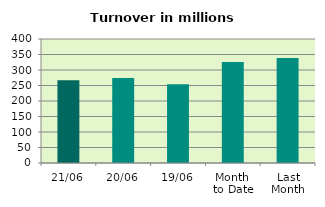
| Category | Series 0 |
|---|---|
| 21/06 | 266.906 |
| 20/06 | 273.948 |
| 19/06 | 253.825 |
| Month 
to Date | 325.573 |
| Last
Month | 338.969 |